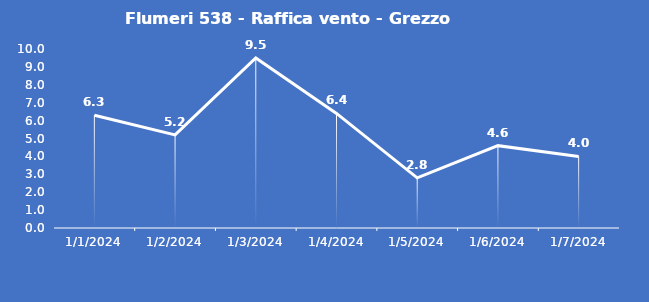
| Category | Flumeri 538 - Raffica vento - Grezzo (m/s) |
|---|---|
| 1/1/24 | 6.3 |
| 1/2/24 | 5.2 |
| 1/3/24 | 9.5 |
| 1/4/24 | 6.4 |
| 1/5/24 | 2.8 |
| 1/6/24 | 4.6 |
| 1/7/24 | 4 |